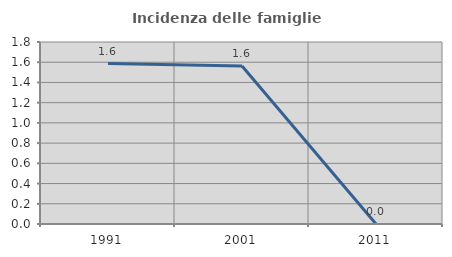
| Category | Incidenza delle famiglie numerose |
|---|---|
| 1991.0 | 1.587 |
| 2001.0 | 1.562 |
| 2011.0 | 0 |